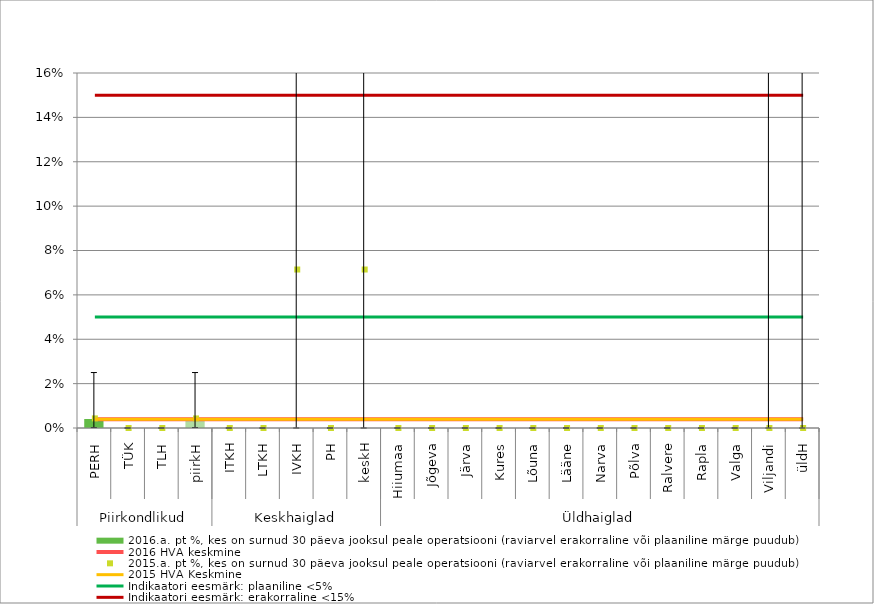
| Category | 2016.a. pt %, kes on surnud 30 päeva jooksul peale operatsiooni (raviarvel erakorraline või plaaniline märge puudub) |
|---|---|
| 0 | 0.004 |
| 1 | 0 |
| 2 | 0 |
| 3 | 0.004 |
| 4 | 0 |
| 5 | 0 |
| 6 | 0 |
| 7 | 0 |
| 8 | 0 |
| 9 | 0 |
| 10 | 0 |
| 11 | 0 |
| 12 | 0 |
| 13 | 0 |
| 14 | 0 |
| 15 | 0 |
| 16 | 0 |
| 17 | 0 |
| 18 | 0 |
| 19 | 0 |
| 20 | 0 |
| 21 | 0 |